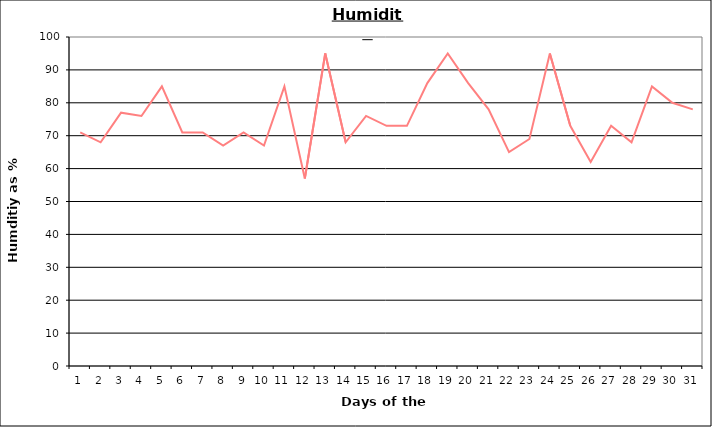
| Category | Series 0 |
|---|---|
| 0 | 71 |
| 1 | 68 |
| 2 | 77 |
| 3 | 76 |
| 4 | 85 |
| 5 | 71 |
| 6 | 71 |
| 7 | 67 |
| 8 | 71 |
| 9 | 67 |
| 10 | 85 |
| 11 | 57 |
| 12 | 95 |
| 13 | 68 |
| 14 | 76 |
| 15 | 73 |
| 16 | 73 |
| 17 | 86 |
| 18 | 95 |
| 19 | 86 |
| 20 | 78 |
| 21 | 65 |
| 22 | 69 |
| 23 | 95 |
| 24 | 73 |
| 25 | 62 |
| 26 | 73 |
| 27 | 68 |
| 28 | 85 |
| 29 | 80 |
| 30 | 78 |